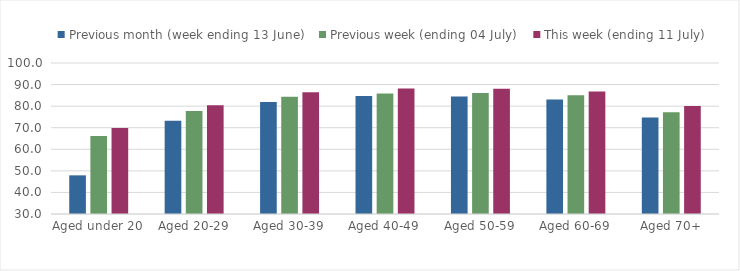
| Category | Previous month (week ending 13 June) | Previous week (ending 04 July) | This week (ending 11 July) |
|---|---|---|---|
| Aged under 20 | 47.921 | 66.168 | 69.888 |
| Aged 20-29 | 73.186 | 77.719 | 80.379 |
| Aged 30-39 | 81.969 | 84.322 | 86.391 |
| Aged 40-49 | 84.682 | 85.85 | 88.185 |
| Aged 50-59 | 84.5 | 86.149 | 88.115 |
| Aged 60-69 | 83.062 | 85.075 | 86.809 |
| Aged 70+ | 74.761 | 77.194 | 80.067 |